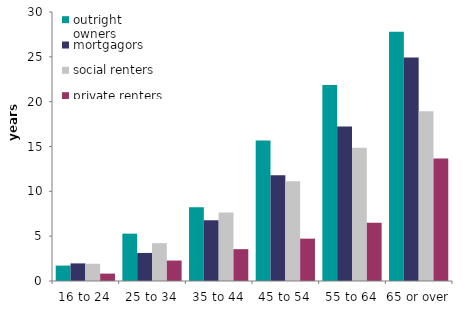
| Category | outright owners | mortgagors | social renters | private renters |
|---|---|---|---|---|
| 16 to 24 | 1.717 | 1.962 | 1.925 | 0.825 |
| 25 to 34 | 5.28 | 3.128 | 4.217 | 2.28 |
| 35 to 44 | 8.237 | 6.772 | 7.649 | 3.55 |
| 45 to 54 | 15.667 | 11.803 | 11.121 | 4.722 |
| 55 to 64 | 21.869 | 17.231 | 14.86 | 6.495 |
| 65 or over | 27.801 | 24.915 | 18.944 | 13.653 |